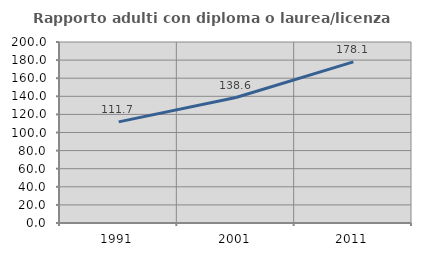
| Category | Rapporto adulti con diploma o laurea/licenza media  |
|---|---|
| 1991.0 | 111.715 |
| 2001.0 | 138.642 |
| 2011.0 | 178.051 |